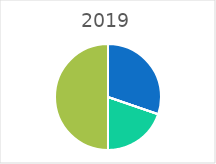
| Category | 2019 |
|---|---|
| Ouvriers | 23 |
| Employés | 0 |
| Maitrise | 0 |
| Ingénieurs et Cadres | 15 |
| Autres | 0 |
| Total | 38 |